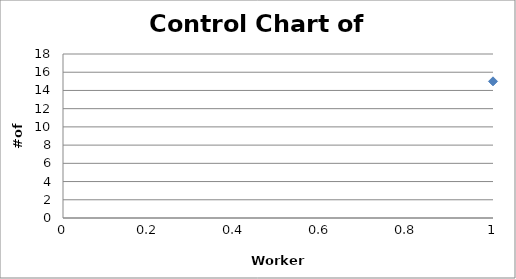
| Category | Series 0 |
|---|---|
| 0 | 15 |
| 1 | 8 |
| 2 | 9 |
| 3 | 14 |
| 4 | 10 |
| 5 | 15 |
| 6 | 12 |
| 7 | 11 |
| 8 | 9 |
| 9 | 11 |
| 10 | 14 |
| 11 | 12 |
| 12 | 17 |
| 13 | 12 |
| 14 | 12 |
| 15 | 11 |
| 16 | 11 |
| 17 | 9 |
| 18 | 8 |
| 19 | 12 |